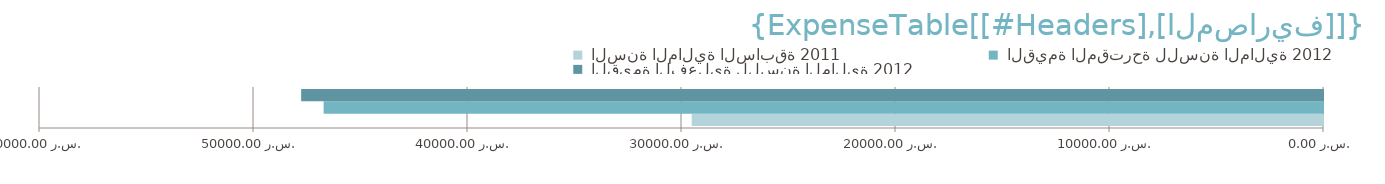
| Category |  السنة المالية السابقة 2011 |  القيمة المقترحة للسنة المالية 2012 |  القيمة الفعلية للسنة المالية 2012 |
|---|---|---|---|
| 0 | 29500 | 46700 | 47750 |